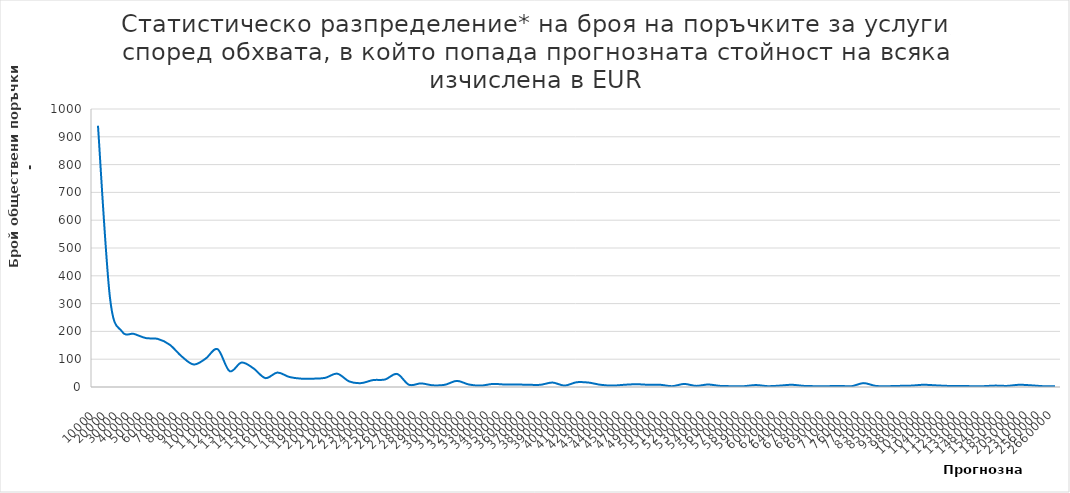
| Category | Series 0 |
|---|---|
| 10000.0 | 940 |
| 20000.0 | 322 |
| 30000.0 | 200 |
| 40000.0 | 191 |
| 50000.0 | 176 |
| 60000.0 | 173 |
| 70000.0 | 152 |
| 80000.0 | 110 |
| 90000.0 | 81 |
| 100000.0 | 102 |
| 110000.0 | 136 |
| 120000.0 | 57 |
| 130000.0 | 88 |
| 140000.0 | 67 |
| 150000.0 | 32 |
| 160000.0 | 52 |
| 170000.0 | 36 |
| 180000.0 | 30 |
| 190000.0 | 30 |
| 200000.0 | 33 |
| 210000.0 | 48 |
| 220000.0 | 20 |
| 230000.0 | 14 |
| 240000.0 | 25 |
| 250000.0 | 27 |
| 260000.0 | 47 |
| 270000.0 | 8 |
| 280000.0 | 13 |
| 290000.0 | 6 |
| 300000.0 | 8 |
| 310000.0 | 22 |
| 320000.0 | 9 |
| 330000.0 | 5 |
| 340000.0 | 11 |
| 350000.0 | 9 |
| 360000.0 | 9 |
| 370000.0 | 8 |
| 380000.0 | 8 |
| 390000.0 | 16 |
| 400000.0 | 5 |
| 410000.0 | 17 |
| 420000.0 | 16 |
| 430000.0 | 8 |
| 440000.0 | 5 |
| 450000.0 | 8 |
| 470000.0 | 10 |
| 490000.0 | 8 |
| 500000.0 | 8 |
| 510000.0 | 3 |
| 520000.0 | 11 |
| 530000.0 | 4 |
| 540000.0 | 9 |
| 560000.0 | 4 |
| 570000.0 | 3 |
| 580000.0 | 3 |
| 590000.0 | 7 |
| 600000.0 | 3 |
| 620000.0 | 5 |
| 640000.0 | 8 |
| 670000.0 | 4 |
| 680000.0 | 3 |
| 690000.0 | 3 |
| 710000.0 | 4 |
| 760000.0 | 3 |
| 770000.0 | 14 |
| 830000.0 | 4 |
| 850000.0 | 3 |
| 930000.0 | 4 |
| 980000.0 | 5 |
| 1030000.0 | 8 |
| 1040000.0 | 6 |
| 1130000.0 | 4 |
| 1230000.0 | 4 |
| 1330000.0 | 3 |
| 1480000.0 | 3 |
| 1540000.0 | 5 |
| 1850000.0 | 4 |
| 2050000.0 | 8 |
| 2310000.0 | 6 |
| 2560000.0 | 3 |
| 2660000.0 | 3 |